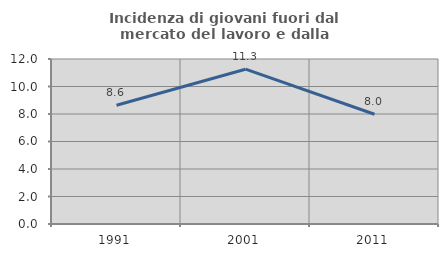
| Category | Incidenza di giovani fuori dal mercato del lavoro e dalla formazione  |
|---|---|
| 1991.0 | 8.632 |
| 2001.0 | 11.258 |
| 2011.0 | 7.982 |